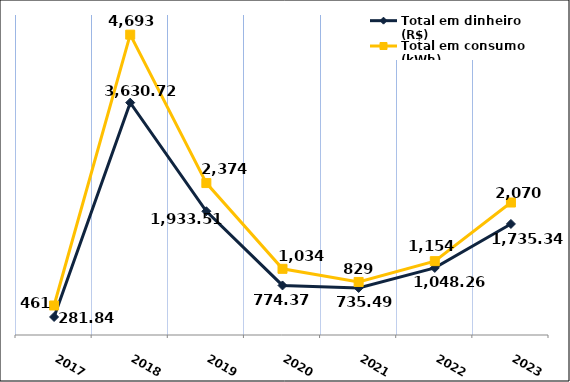
| Category | Total em dinheiro (R$) |
|---|---|
| 2017.0 | 281.84 |
| 2018.0 | 3630.72 |
| 2019.0 | 1933.51 |
| 2020.0 | 774.37 |
| 2021.0 | 735.49 |
| 2022.0 | 1048.26 |
| 2023.0 | 1735.34 |